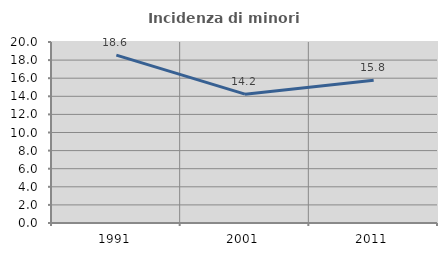
| Category | Incidenza di minori stranieri |
|---|---|
| 1991.0 | 18.557 |
| 2001.0 | 14.237 |
| 2011.0 | 15.782 |